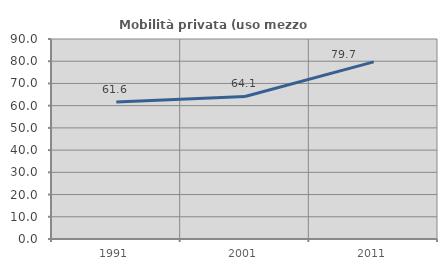
| Category | Mobilità privata (uso mezzo privato) |
|---|---|
| 1991.0 | 61.605 |
| 2001.0 | 64.13 |
| 2011.0 | 79.696 |